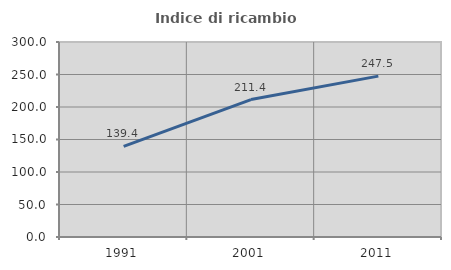
| Category | Indice di ricambio occupazionale  |
|---|---|
| 1991.0 | 139.394 |
| 2001.0 | 211.429 |
| 2011.0 | 247.5 |